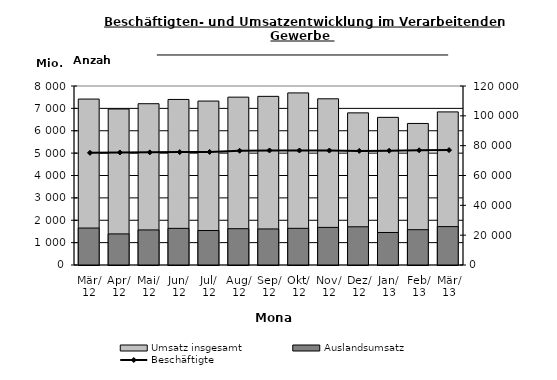
| Category | Umsatz insgesamt | Auslandsumsatz |
|---|---|---|
| 2012-03-01 | 7416.484 | 1651.678 |
| 2012-04-01 | 6972.158 | 1389.091 |
| 2012-05-01 | 7208.203 | 1567.272 |
| 2012-06-01 | 7399.131 | 1636.887 |
| 2012-07-01 | 7327.339 | 1540.606 |
| 2012-08-01 | 7501.535 | 1622.307 |
| 2012-09-01 | 7537.073 | 1611.325 |
| 2012-10-01 | 7691.386 | 1638.671 |
| 2012-11-01 | 7427.668 | 1680.559 |
| 2012-12-01 | 6799.178 | 1707.786 |
| 2013-01-01 | 6598.983 | 1453.122 |
| 2013-02-01 | 6326.057 | 1578.148 |
| 2013-03-01 | 6842.406 | 1716.184 |